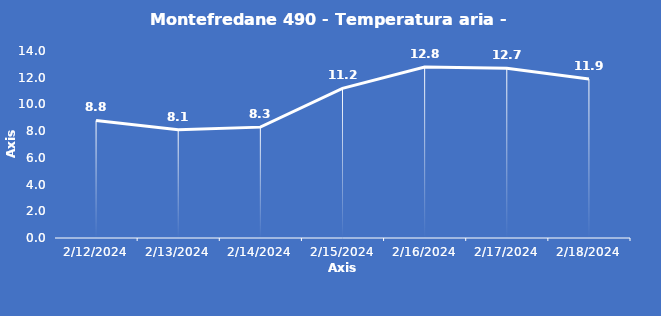
| Category | Montefredane 490 - Temperatura aria - Grezzo (°C) |
|---|---|
| 2/12/24 | 8.8 |
| 2/13/24 | 8.1 |
| 2/14/24 | 8.3 |
| 2/15/24 | 11.2 |
| 2/16/24 | 12.8 |
| 2/17/24 | 12.7 |
| 2/18/24 | 11.9 |